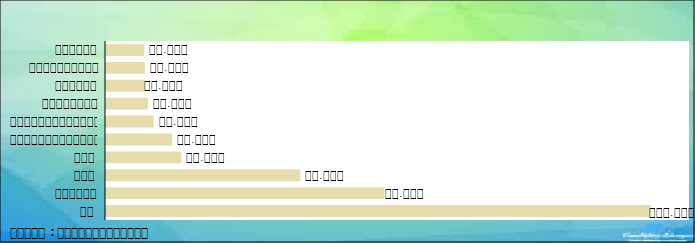
| Category | Series 0 |
|---|---|
| ថៃ | 149291 |
| វៀតណាម | 76331 |
| ចិន | 53230 |
| ឡាវ | 20669 |
| សហរដ្ឋអាមេរិក | 18087 |
| កូរ៉េខាងត្បូង | 13056 |
| អង់គ្លេស | 11508 |
| បារាំង | 10694 |
| ឥណ្ឌូនេស៊ី | 10639 |
| រុស្សី​ | 10494 |